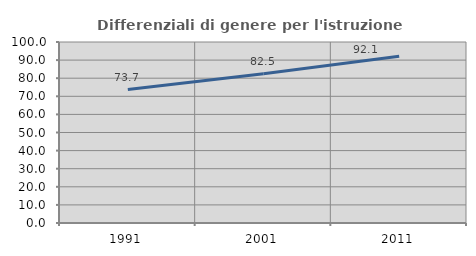
| Category | Differenziali di genere per l'istruzione superiore |
|---|---|
| 1991.0 | 73.734 |
| 2001.0 | 82.518 |
| 2011.0 | 92.141 |